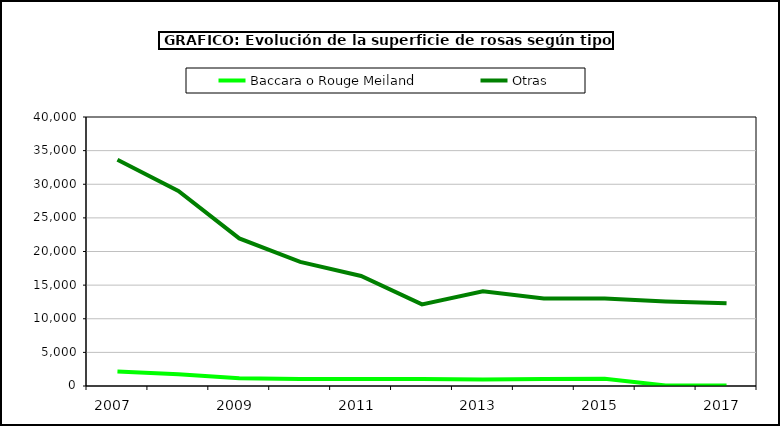
| Category | Baccara o Rouge Meiland | Otras |
|---|---|---|
| 2007.0 | 2159 | 33641 |
| 2008.0 | 1760 | 29013 |
| 2009.0 | 1160 | 21945 |
| 2010.0 | 1050 | 18446 |
| 2011.0 | 1050 | 16360 |
| 2012.0 | 1050 | 12133 |
| 2013.0 | 950 | 14093 |
| 2014.0 | 1050 | 13013 |
| 2015.0 | 1070 | 13016 |
| 2016.0 | 79 | 12572 |
| 2017.0 | 79 | 12292 |